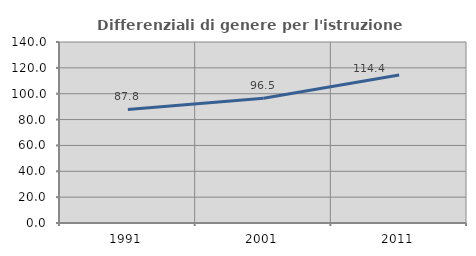
| Category | Differenziali di genere per l'istruzione superiore |
|---|---|
| 1991.0 | 87.83 |
| 2001.0 | 96.547 |
| 2011.0 | 114.415 |